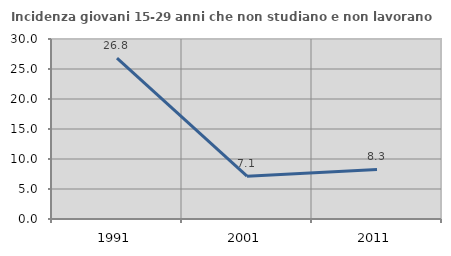
| Category | Incidenza giovani 15-29 anni che non studiano e non lavorano  |
|---|---|
| 1991.0 | 26.829 |
| 2001.0 | 7.13 |
| 2011.0 | 8.269 |